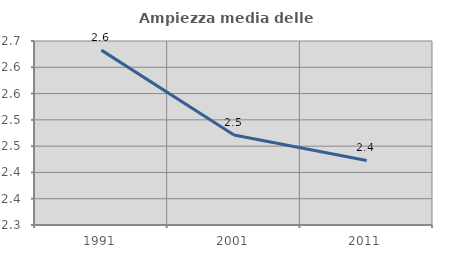
| Category | Ampiezza media delle famiglie |
|---|---|
| 1991.0 | 2.633 |
| 2001.0 | 2.471 |
| 2011.0 | 2.423 |